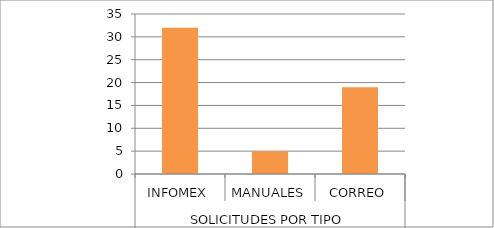
| Category | Series 0 |
|---|---|
| 0 | 32 |
| 1 | 5 |
| 2 | 19 |